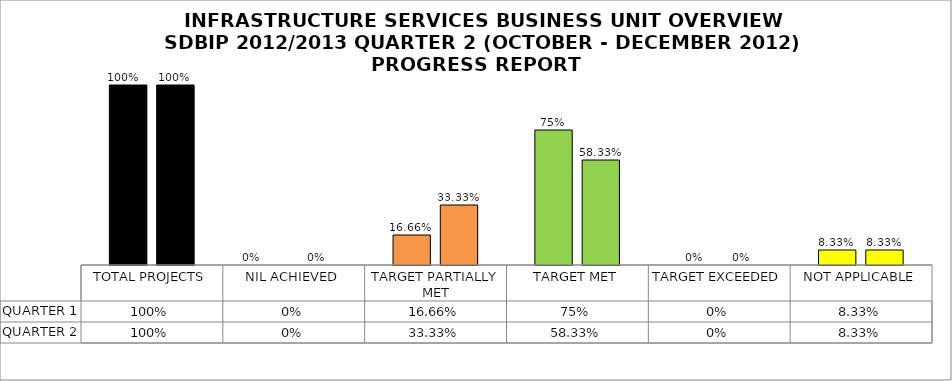
| Category | QUARTER 1 | QUARTER 2 |
|---|---|---|
| TOTAL PROJECTS | 1 | 1 |
| NIL ACHIEVED | 0 | 0 |
| TARGET PARTIALLY MET | 0.167 | 0.333 |
| TARGET MET | 0.75 | 0.583 |
| TARGET EXCEEDED | 0 | 0 |
| NOT APPLICABLE | 0.083 | 0.083 |